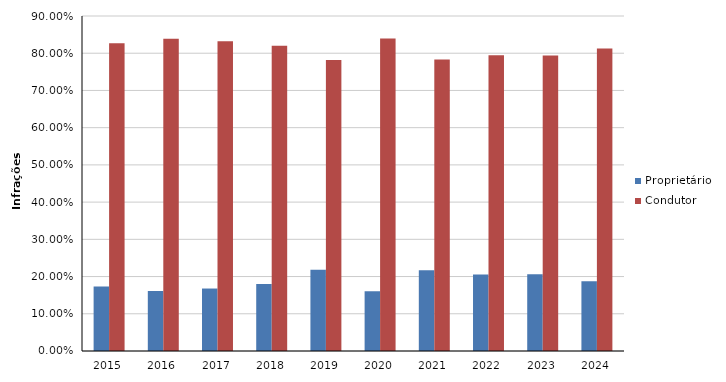
| Category | Proprietário | Condutor |
|---|---|---|
| 2015 | 0.173 | 0.827 |
| 2016 | 0.161 | 0.839 |
| 2017 | 0.168 | 0.832 |
| 2018 | 0.18 | 0.82 |
| 2019 | 0.218 | 0.782 |
| 2020 | 0.161 | 0.839 |
| 2021 | 0.217 | 0.783 |
| 2022 | 0.206 | 0.794 |
| 2023 | 0.206 | 0.794 |
| 2024 | 0.188 | 0.812 |